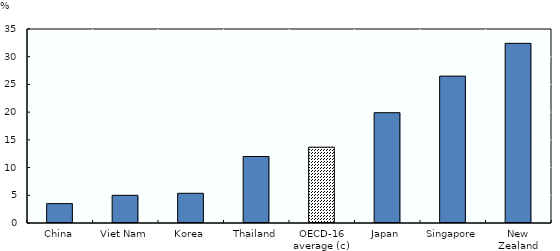
| Category | % |
|---|---|
| China | 3.5 |
| Viet Nam | 5 |
| Korea | 5.359 |
| Thailand | 12 |
| OECD-16 average (c) | 13.676 |
| Japan | 19.9 |
| Singapore | 26.5 |
| New Zealand | 32.413 |